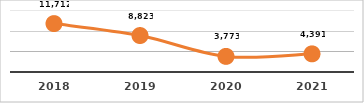
| Category | SERVICIOS TECNOLÓGICOS PROPORCIONADOS
PRIMER SEMESTRE, EJERCICIO 2021 |
|---|---|
| 2018.0 | 11712 |
| 2019.0 | 8823 |
| 2020.0 | 3773 |
| 2021.0 | 4391 |